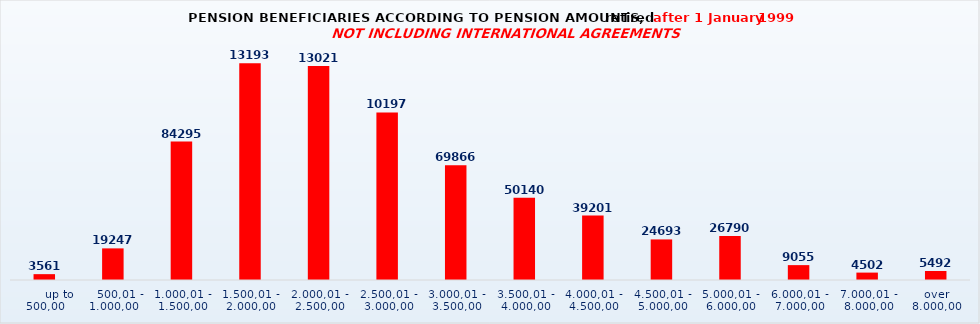
| Category | Series 0 |
|---|---|
|       up to 500,00 | 3561 |
|    500,01 - 1.000,00 | 19247 |
| 1.000,01 - 1.500,00 | 84295 |
| 1.500,01 - 2.000,00 | 131938 |
| 2.000,01 - 2.500,00 | 130217 |
| 2.500,01 - 3.000,00 | 101971 |
| 3.000,01 - 3.500,00 | 69866 |
| 3.500,01 - 4.000,00 | 50140 |
| 4.000,01 - 4.500,00 | 39201 |
| 4.500,01 - 5.000,00 | 24693 |
| 5.000,01 - 6.000,00 | 26790 |
| 6.000,01 - 7.000,00 | 9055 |
| 7.000,01 - 8.000,00 | 4502 |
| over 8.000,00 | 5492 |